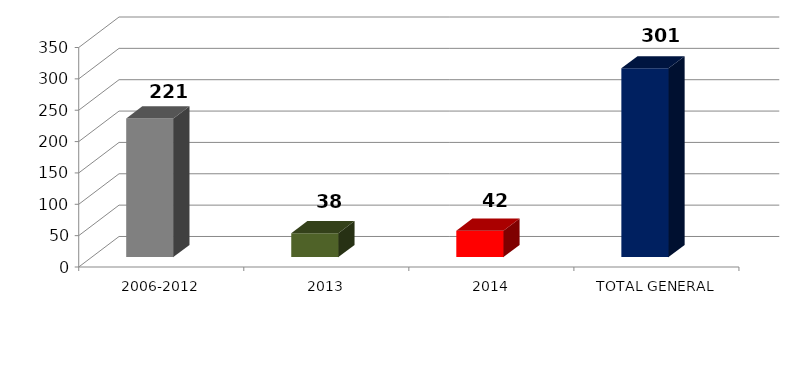
| Category | Series 0 | Series 1 |
|---|---|---|
| 2006-2012 | 221 |  |
| 2013 | 38 |  |
| 2014 | 42 |  |
| TOTAL GENERAL | 301 |  |